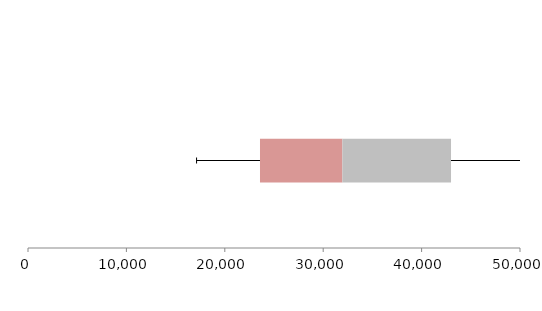
| Category | Series 1 | Series 2 | Series 3 |
|---|---|---|---|
| 0 | 23577.159 | 8372.459 | 11039.038 |